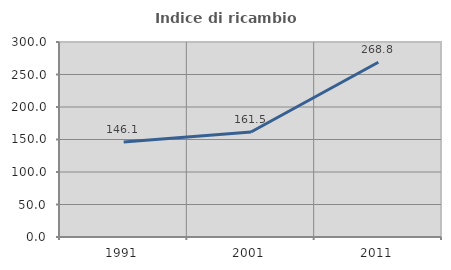
| Category | Indice di ricambio occupazionale  |
|---|---|
| 1991.0 | 146.078 |
| 2001.0 | 161.497 |
| 2011.0 | 268.79 |